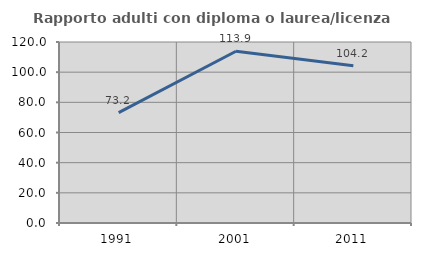
| Category | Rapporto adulti con diploma o laurea/licenza media  |
|---|---|
| 1991.0 | 73.222 |
| 2001.0 | 113.879 |
| 2011.0 | 104.249 |